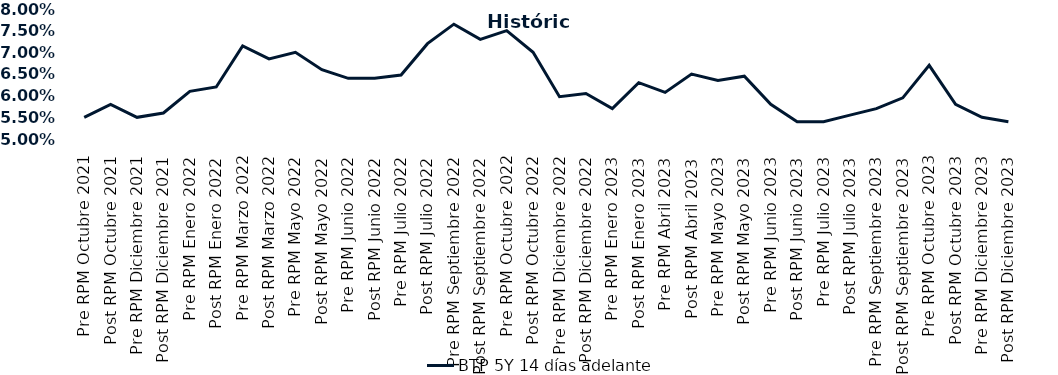
| Category | BTP 5Y 14 días adelante |
|---|---|
| Pre RPM Octubre 2021 | 0.055 |
| Post RPM Octubre 2021 | 0.058 |
| Pre RPM Diciembre 2021 | 0.055 |
| Post RPM Diciembre 2021 | 0.056 |
| Pre RPM Enero 2022 | 0.061 |
| Post RPM Enero 2022 | 0.062 |
| Pre RPM Marzo 2022 | 0.072 |
| Post RPM Marzo 2022 | 0.068 |
| Pre RPM Mayo 2022 | 0.07 |
| Post RPM Mayo 2022 | 0.066 |
| Pre RPM Junio 2022 | 0.064 |
| Post RPM Junio 2022 | 0.064 |
| Pre RPM Julio 2022 | 0.065 |
| Post RPM Julio 2022 | 0.072 |
| Pre RPM Septiembre 2022 | 0.076 |
| Post RPM Septiembre 2022 | 0.073 |
| Pre RPM Octubre 2022 | 0.075 |
| Post RPM Octubre 2022 | 0.07 |
| Pre RPM Diciembre 2022 | 0.06 |
| Post RPM Diciembre 2022 | 0.06 |
| Pre RPM Enero 2023 | 0.057 |
| Post RPM Enero 2023 | 0.063 |
| Pre RPM Abril 2023 | 0.061 |
| Post RPM Abril 2023 | 0.065 |
| Pre RPM Mayo 2023 | 0.064 |
| Post RPM Mayo 2023 | 0.064 |
| Pre RPM Junio 2023 | 0.058 |
| Post RPM Junio 2023 | 0.054 |
| Pre RPM Julio 2023 | 0.054 |
| Post RPM Julio 2023 | 0.056 |
| Pre RPM Septiembre 2023 | 0.057 |
| Post RPM Septiembre 2023 | 0.06 |
| Pre RPM Octubre 2023 | 0.067 |
| Post RPM Octubre 2023 | 0.058 |
| Pre RPM Diciembre 2023 | 0.055 |
| Post RPM Diciembre 2023 | 0.054 |